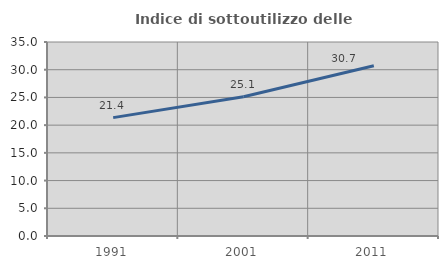
| Category | Indice di sottoutilizzo delle abitazioni  |
|---|---|
| 1991.0 | 21.356 |
| 2001.0 | 25.113 |
| 2011.0 | 30.713 |